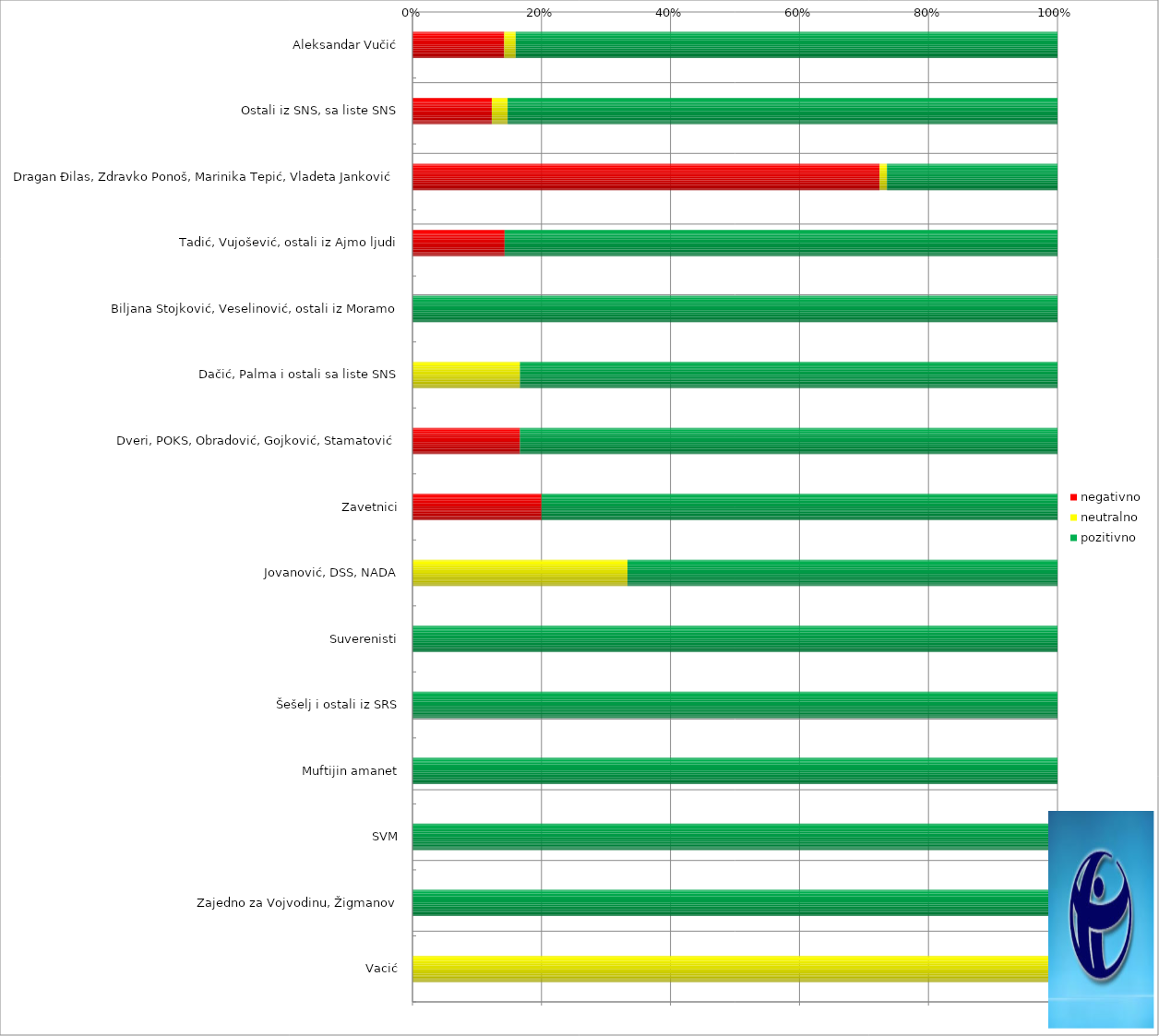
| Category | negativno | neutralno | pozitivno |
|---|---|---|---|
| Aleksandar Vučić | 32 | 4 | 189 |
| Ostali iz SNS, sa liste SNS | 15 | 3 | 104 |
| Dragan Đilas, Zdravko Ponoš, Marinika Tepić, Vladeta Janković | 63 | 1 | 23 |
| Tadić, Vujošević, ostali iz Ajmo ljudi | 2 | 0 | 12 |
| Biljana Stojković, Veselinović, ostali iz Moramo | 0 | 0 | 13 |
| Dačić, Palma i ostali sa liste SNS | 0 | 2 | 10 |
| Dveri, POKS, Obradović, Gojković, Stamatović | 1 | 0 | 5 |
| Zavetnici | 1 | 0 | 4 |
| Jovanović, DSS, NADA | 0 | 1 | 2 |
| Suverenisti | 0 | 0 | 4 |
| Šešelj i ostali iz SRS | 0 | 0 | 2 |
| Muftijin amanet | 0 | 0 | 2 |
| SVM | 0 | 0 | 2 |
| Zajedno za Vojvodinu, Žigmanov | 0 | 0 | 1 |
| Vacić | 0 | 1 | 0 |